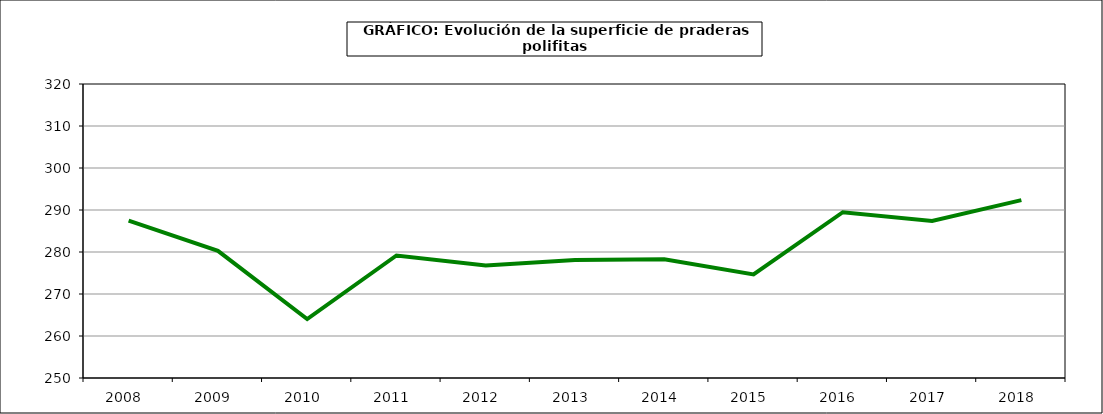
| Category | Superficie |
|---|---|
| 2008.0 | 287.487 |
| 2009.0 | 280.266 |
| 2010.0 | 264.037 |
| 2011.0 | 279.178 |
| 2012.0 | 276.784 |
| 2013.0 | 278.082 |
| 2014.0 | 278.257 |
| 2015.0 | 274.641 |
| 2016.0 | 289.468 |
| 2017.0 | 287.402 |
| 2018.0 | 292.359 |